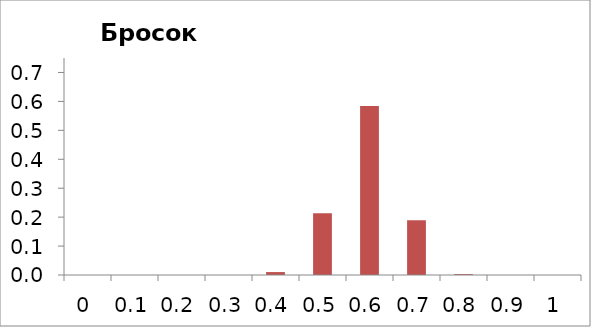
| Category | Series 1 |
|---|---|
| 0.0 | 0 |
| 0.1 | 0 |
| 0.2 | 0 |
| 0.3 | 0 |
| 0.4 | 0.01 |
| 0.5 | 0.213 |
| 0.6 | 0.584 |
| 0.7 | 0.189 |
| 0.8 | 0.003 |
| 0.9 | 0 |
| 1.0 | 0 |